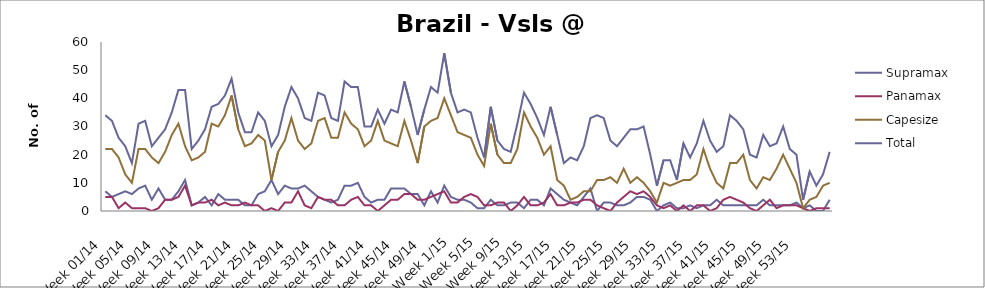
| Category | Supramax | Panamax | Capesize | Total |
|---|---|---|---|---|
| Week 01/14 | 7 | 5 | 22 | 34 |
| Week 02/14 | 5 | 5 | 22 | 32 |
| Week 03/14 | 6 | 1 | 19 | 26 |
| Week 04/14 | 7 | 3 | 13 | 23 |
| Week 05/14 | 6 | 1 | 10 | 17 |
| Week 06/14 | 8 | 1 | 22 | 31 |
| Week 07/14 | 9 | 1 | 22 | 32 |
| Week 08/14 | 4 | 0 | 19 | 23 |
| Week 09/14 | 8 | 1 | 17 | 26 |
| Week 10/14 | 4 | 4 | 21 | 29 |
| Week 11/14 | 4 | 4 | 27 | 35 |
| Week 12/14 | 7 | 5 | 31 | 43 |
| Week 13/14 | 11 | 9 | 23 | 43 |
| Week 14/14 | 2 | 2 | 18 | 22 |
| Week 15/14 | 3 | 3 | 19 | 25 |
| Week 16/14 | 5 | 3 | 21 | 29 |
| Week 17/14 | 2 | 4 | 31 | 37 |
| Week 18/14 | 6 | 2 | 30 | 38 |
| Week 19/14 | 4 | 3 | 34 | 41 |
| Week 20/14 | 4 | 2 | 41 | 47 |
| Week 21/14 | 4 | 2 | 29 | 35 |
| Week 22/14 | 2 | 3 | 23 | 28 |
| Week 23/14 | 2 | 2 | 24 | 28 |
| Week 24/14 | 6 | 2 | 27 | 35 |
| Week 25/14 | 7 | 0 | 25 | 32 |
| Week 26/14 | 11 | 1 | 11 | 23 |
| Week 27/14 | 6 | 0 | 21 | 27 |
| Week 28/14 | 9 | 3 | 25 | 37 |
| Week 29/14 | 8 | 3 | 33 | 44 |
| Week 30/14 | 8 | 7 | 25 | 40 |
| Week 31/14 | 9 | 2 | 22 | 33 |
| Week 32/14 | 7 | 1 | 24 | 32 |
| Week 33/14 | 5 | 5 | 32 | 42 |
| Week 34/14 | 4 | 4 | 33 | 41 |
| Week 35/14 | 3 | 4 | 26 | 33 |
| Week 36/14 | 4 | 2 | 26 | 32 |
| Week 37/14 | 9 | 2 | 35 | 46 |
| Week 38/14 | 9 | 4 | 31 | 44 |
| Week 39/14 | 10 | 5 | 29 | 44 |
| Week 40/14 | 5 | 2 | 23 | 30 |
| Week 41/14 | 3 | 2 | 25 | 30 |
| Week 42/14 | 4 | 0 | 32 | 36 |
| Week 43/14 | 4 | 2 | 25 | 31 |
| Week 44/14 | 8 | 4 | 24 | 36 |
| Week 45/14 | 8 | 4 | 23 | 35 |
| Week 46/14 | 8 | 6 | 32 | 46 |
| Week 47/14 | 6 | 6 | 25 | 37 |
| Week 48/14 | 6 | 4 | 17 | 27 |
| Week 49/14 | 2 | 4 | 30 | 36 |
| Week 50/14 | 7 | 5 | 32 | 44 |
| Week 51/14 | 3 | 6 | 33 | 42 |
| Week 52/14 | 9 | 7 | 40 | 56 |
| Week 1/15 | 5 | 3 | 34 | 42 |
| Week 2/15 | 4 | 3 | 28 | 35 |
| Week 3/15 | 4 | 5 | 27 | 36 |
| Week 4/15 | 3 | 6 | 26 | 35 |
| Week 5/15 | 1 | 5 | 20 | 26 |
| Week 6/15 | 1 | 2 | 16 | 19 |
| Week 7/15 | 4 | 2 | 31 | 37 |
| Week 8/15 | 2 | 3 | 20 | 25 |
| Week 9/15 | 2 | 3 | 17 | 22 |
| Week 10/15 | 3 | 0 | 17 | 21 |
| Week 11/15 | 3 | 2 | 22 | 31 |
| Week 12/15 | 1 | 5 | 35 | 42 |
| Week 13/15 | 4 | 2 | 30 | 38 |
| Week 14/15 | 4 | 2 | 26 | 33 |
| Week 15/15 | 2 | 3 | 20 | 27 |
| Week 16/15 | 8 | 6 | 23 | 37 |
| Week 17/15 | 6 | 2 | 11 | 27 |
| Week 18/15 | 4 | 2 | 9 | 17 |
| Week 19/15 | 3 | 3 | 4 | 19 |
| Week 20/15 | 2 | 3 | 5 | 18 |
| Week 21/15 | 5 | 4 | 7 | 23 |
| Week 22/15 | 8 | 4 | 7 | 33 |
| Week 23/15 | 0 | 2 | 11 | 34 |
| Week 24/15 | 3 | 1 | 11 | 33 |
| Week 25/15 | 3 | 0 | 12 | 25 |
| Week 26/15 | 2 | 3 | 10 | 23 |
| Week 27/15 | 2 | 5 | 15 | 26 |
| Week 28/15 | 3 | 7 | 10 | 29 |
| Week 29/15 | 5 | 6 | 12 | 29 |
| Week 30/15 | 5 | 7 | 10 | 30 |
| Week 31/15 | 4 | 5 | 7 | 20 |
| Week 32/15 | 0 | 2 | 3 | 9 |
| Week 33/15 | 2 | 1 | 10 | 18 |
| Week 34/15 | 3 | 2 | 9 | 18 |
| Week 35/15 | 1 | 0 | 10 | 11 |
| Week 36/15 | 1 | 2 | 11 | 24 |
| Week 37/15 | 2 | 0 | 11 | 19 |
| Week 38/15 | 1 | 2 | 13 | 24 |
| Week 39/15 | 2 | 2 | 22 | 32 |
| Week 40/15 | 2 | 0 | 15 | 25 |
| Week 41/15 | 4 | 1 | 10 | 21 |
| Week 42/15 | 2 | 4 | 8 | 23 |
| Week 43/15 | 2 | 5 | 17 | 34 |
| Week 44/15 | 2 | 4 | 17 | 32 |
| Week 45/15 | 2 | 3 | 20 | 29 |
| Week 46/15 | 2 | 1 | 11 | 20 |
| Week 47/15 | 2 | 0 | 8 | 19 |
| Week 48/15 | 4 | 2 | 12 | 27 |
| Week 49/15 | 2 | 4 | 11 | 23 |
| Week 50/15 | 2 | 1 | 15 | 24 |
| Week 51/15 | 2 | 2 | 20 | 30 |
| Week 52/15 | 2 | 2 | 15 | 22 |
| Week 53/15 | 3 | 2 | 10 | 20 |
| Week 01/16 | 1 | 1 | 1 | 4 |